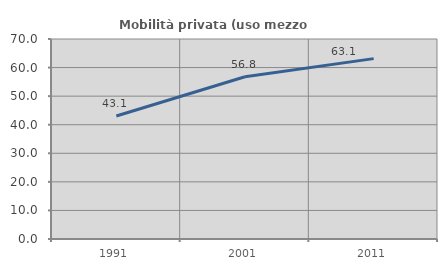
| Category | Mobilità privata (uso mezzo privato) |
|---|---|
| 1991.0 | 43.07 |
| 2001.0 | 56.775 |
| 2011.0 | 63.132 |